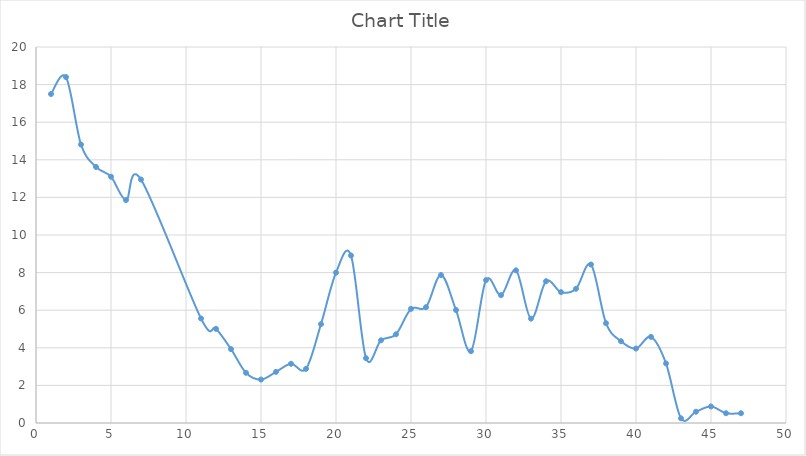
| Category | Series 0 |
|---|---|
| 1.0 | 17.5 |
| 2.0 | 18.4 |
| 3.0 | 14.81 |
| 4.0 | 13.62 |
| 5.0 | 13.1 |
| 6.0 | 11.86 |
| 7.0 | 12.95 |
| 11.0 | 5.56 |
| 12.0 | 5.01 |
| 13.0 | 3.93 |
| 14.0 | 2.67 |
| 15.0 | 2.31 |
| 16.0 | 2.72 |
| 17.0 | 3.15 |
| 18.0 | 2.88 |
| 19.0 | 5.26 |
| 20.0 | 8 |
| 21.0 | 8.91 |
| 22.0 | 3.45 |
| 23.0 | 4.4 |
| 24.0 | 4.72 |
| 25.0 | 6.07 |
| 26.0 | 6.16 |
| 27.0 | 7.87 |
| 28.0 | 6.01 |
| 29.0 | 3.82 |
| 30.0 | 7.6 |
| 31.0 | 6.8 |
| 32.0 | 8.12 |
| 33.0 | 5.55 |
| 34.0 | 7.54 |
| 35.0 | 6.96 |
| 36.0 | 7.14 |
| 37.0 | 8.43 |
| 38.0 | 5.31 |
| 39.0 | 4.35 |
| 40.0 | 3.96 |
| 41.0 | 4.58 |
| 42.0 | 3.17 |
| 43.0 | 0.25 |
| 44.0 | 0.6 |
| 45.0 | 0.88 |
| 46.0 | 0.52 |
| 47.0 | 0.52 |